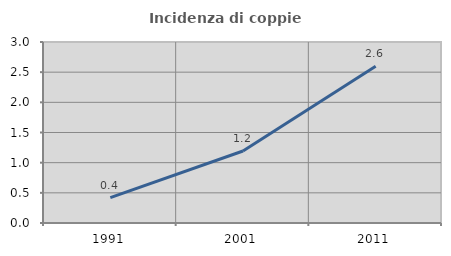
| Category | Incidenza di coppie miste |
|---|---|
| 1991.0 | 0.419 |
| 2001.0 | 1.194 |
| 2011.0 | 2.597 |